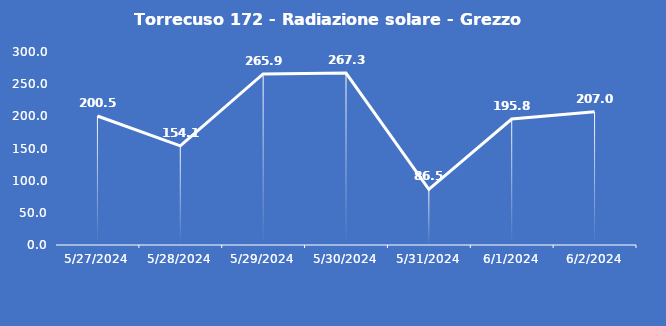
| Category | Torrecuso 172 - Radiazione solare - Grezzo (W/m2) |
|---|---|
| 5/27/24 | 200.5 |
| 5/28/24 | 154.1 |
| 5/29/24 | 265.9 |
| 5/30/24 | 267.3 |
| 5/31/24 | 86.5 |
| 6/1/24 | 195.8 |
| 6/2/24 | 207 |